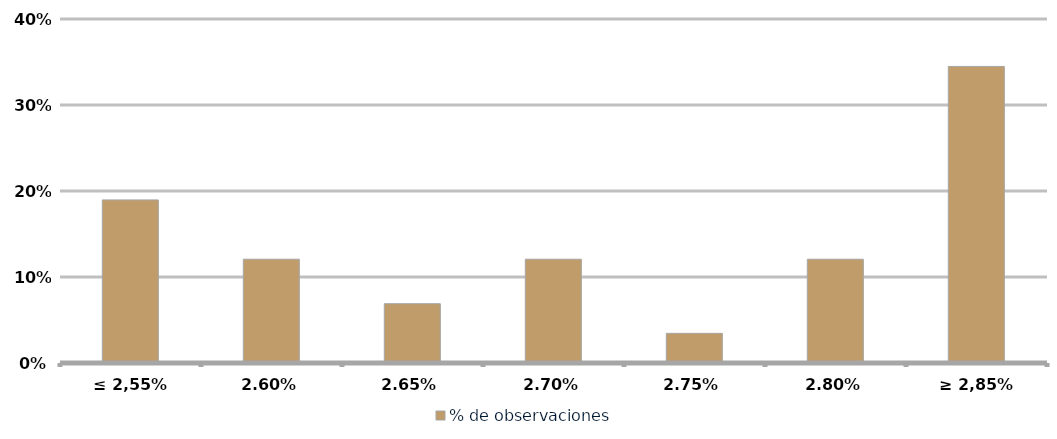
| Category | % de observaciones  |
|---|---|
| ≤ 2,55% | 0.19 |
| 2,60% | 0.121 |
| 2,65% | 0.069 |
| 2,70% | 0.121 |
| 2,75% | 0.034 |
| 2,80% | 0.121 |
| ≥ 2,85% | 0.345 |